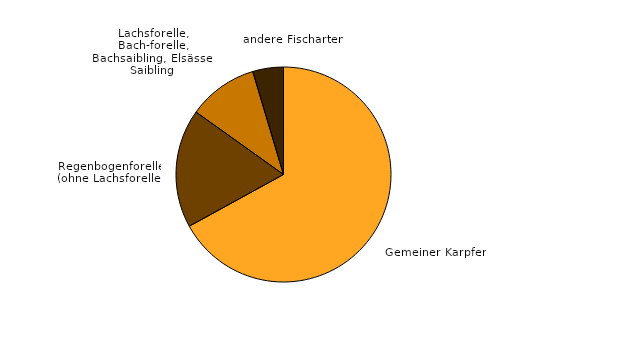
| Category | Series 0 |
|---|---|
| Gemeiner Karpfen | 573.7 |
| Regenbogenforelle (ohne Lachsforelle) | 152.9 |
| Lachsforelle, Bachforelle, Bachsaibling, Elsässer Saibling | 90.1 |
| andere Fischarten | 39.5 |